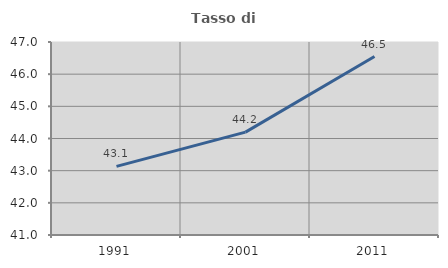
| Category | Tasso di occupazione   |
|---|---|
| 1991.0 | 43.134 |
| 2001.0 | 44.198 |
| 2011.0 | 46.547 |